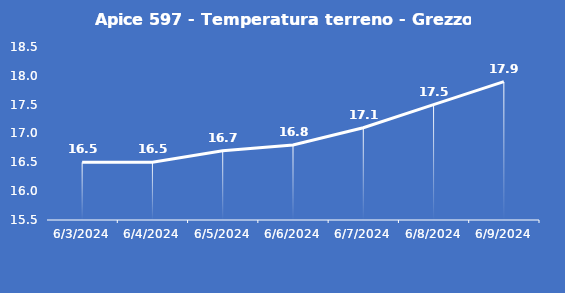
| Category | Apice 597 - Temperatura terreno - Grezzo (°C) |
|---|---|
| 6/3/24 | 16.5 |
| 6/4/24 | 16.5 |
| 6/5/24 | 16.7 |
| 6/6/24 | 16.8 |
| 6/7/24 | 17.1 |
| 6/8/24 | 17.5 |
| 6/9/24 | 17.9 |